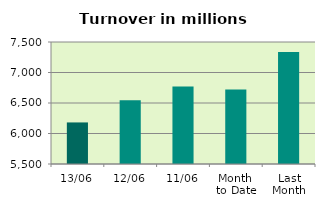
| Category | Series 0 |
|---|---|
| 13/06 | 6181.437 |
| 12/06 | 6545.03 |
| 11/06 | 6771.847 |
| Month 
to Date | 6719.776 |
| Last
Month | 7336.2 |